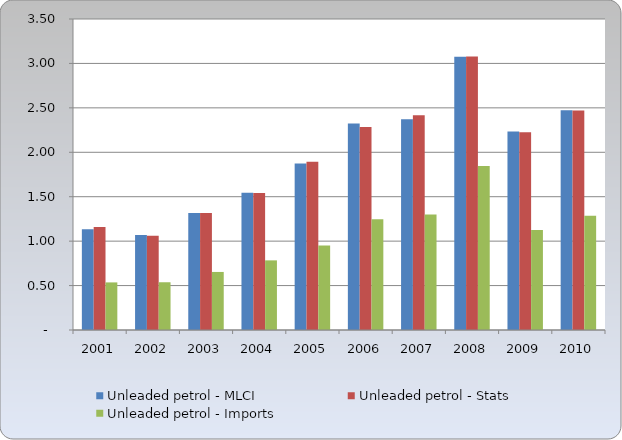
| Category | Unleaded petrol - MLCI | Unleaded petrol - Stats | Unleaded petrol - Imports |
|---|---|---|---|
| 2001.0 | 1.134 | 1.16 | 0.536 |
| 2002.0 | 1.069 | 1.06 | 0.537 |
| 2003.0 | 1.317 | 1.317 | 0.653 |
| 2004.0 | 1.544 | 1.543 | 0.784 |
| 2005.0 | 1.875 | 1.893 | 0.951 |
| 2006.0 | 2.325 | 2.283 | 1.247 |
| 2007.0 | 2.372 | 2.418 | 1.299 |
| 2008.0 | 3.076 | 3.077 | 1.846 |
| 2009.0 | 2.234 | 2.226 | 1.126 |
| 2010.0 | 2.474 | 2.471 | 1.284 |